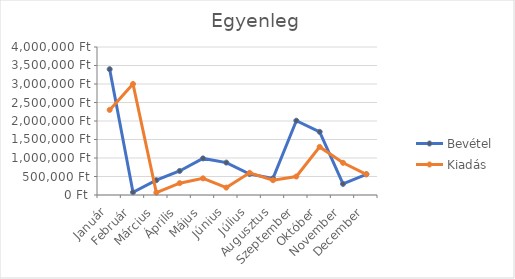
| Category | Bevétel | Kiadás |
|---|---|---|
| Január | 3400000 | 2300000 |
| Február | 75000 | 3000000 |
| Március | 400000 | 65000 |
| Április | 650000 | 320000 |
| Május | 989000 | 450000 |
| Június | 876000 | 200000 |
| Július | 568000 | 600000 |
| Augusztus | 450000 | 400000 |
| Szeptember | 2008000 | 500000 |
| Október | 1707000 | 1300000 |
| November | 300000 | 870000 |
| December | 560000 | 560000 |